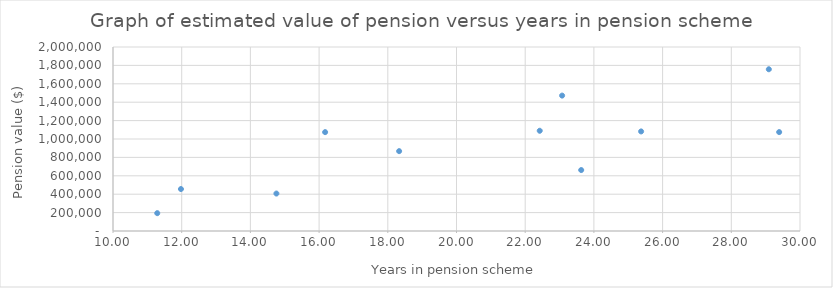
| Category | Series 0 |
|---|---|
| 16.175222450376456 | 1074675.008 |
| 22.42299794661191 | 1089462.071 |
| 25.374401095140314 | 1082280.938 |
| 29.39356605065024 | 1075070.904 |
| 23.07460643394935 | 1471764.072 |
| 18.32991101984942 | 867922.572 |
| 29.09240246406571 | 1758085.984 |
| 11.978097193702943 | 456038.852 |
| 11.288158795345653 | 193950.797 |
| 14.757015742642025 | 407096.458 |
| 23.630390143737166 | 662451.025 |